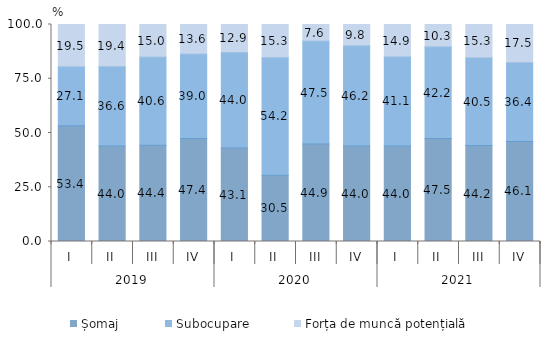
| Category | Șomaj | Subocupare | Forța de muncă potențială |
|---|---|---|---|
| 0 | 53.374 | 27.147 | 19.479 |
| 1 | 43.979 | 36.649 | 19.372 |
| 2 | 44.366 | 40.61 | 15.023 |
| 3 | 47.447 | 38.979 | 13.574 |
| 4 | 43.127 | 44.01 | 12.863 |
| 5 | 30.523 | 54.216 | 15.261 |
| 6 | 44.874 | 47.548 | 7.578 |
| 7 | 44 | 46.2 | 9.8 |
| 8 | 44 | 41.1 | 14.9 |
| 9 | 47.504 | 42.209 | 10.287 |
| 10 | 44.2 | 40.5 | 15.3 |
| 11 | 46.1 | 36.4 | 17.5 |